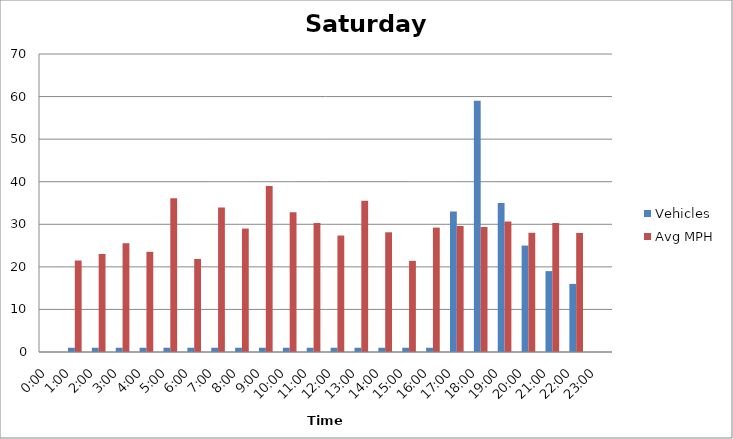
| Category | Vehicles | Avg MPH |
|---|---|---|
| 0:00 | 0 | 0 |
| 1:00 | 1 | 21.49 |
| 2:00 | 1 | 23.02 |
| 3:00 | 1 | 25.55 |
| 4:00 | 1 | 23.53 |
| 5:00 | 1 | 36.13 |
| 6:00 | 1 | 21.85 |
| 7:00 | 1 | 33.95 |
| 8:00 | 1 | 28.99 |
| 9:00 | 1 | 39.02 |
| 10:00 | 1 | 32.82 |
| 11:00 | 1 | 30.33 |
| 12:00 | 1 | 27.36 |
| 13:00 | 1 | 35.52 |
| 14:00 | 1 | 28.12 |
| 15:00 | 1 | 21.41 |
| 16:00 | 1 | 29.22 |
| 17:00 | 33 | 29.6 |
| 18:00 | 59 | 29.36 |
| 19:00 | 35 | 30.67 |
| 20:00 | 25 | 28.01 |
| 21:00 | 19 | 30.33 |
| 22:00 | 16 | 27.97 |
| 23:00 | 0 | 0 |